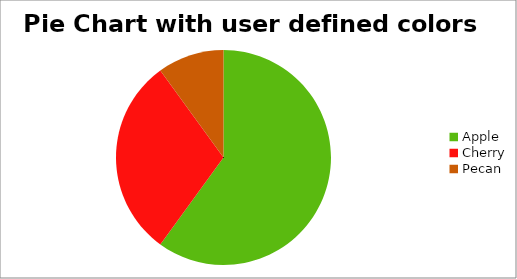
| Category | Pie sales data |
|---|---|
| Apple | 60 |
| Cherry | 30 |
| Pecan | 10 |